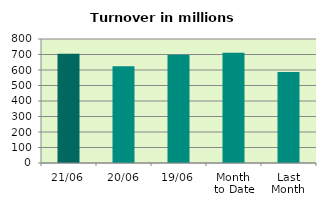
| Category | Series 0 |
|---|---|
| 21/06 | 705.364 |
| 20/06 | 623.867 |
| 19/06 | 698.003 |
| Month 
to Date | 711.368 |
| Last
Month | 587.249 |